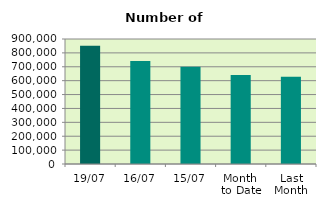
| Category | Series 0 |
|---|---|
| 19/07 | 851952 |
| 16/07 | 740722 |
| 15/07 | 699746 |
| Month 
to Date | 641569.538 |
| Last
Month | 628899 |